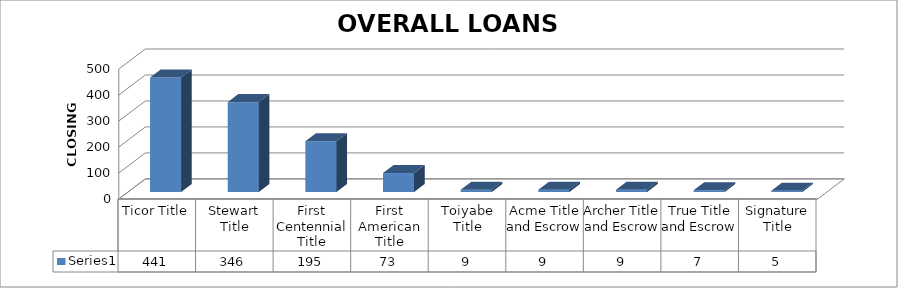
| Category | Series 0 |
|---|---|
| Ticor Title | 441 |
| Stewart Title | 346 |
| First Centennial Title | 195 |
| First American Title | 73 |
| Toiyabe Title | 9 |
| Acme Title and Escrow | 9 |
| Archer Title and Escrow | 9 |
| True Title and Escrow | 7 |
| Signature Title | 5 |